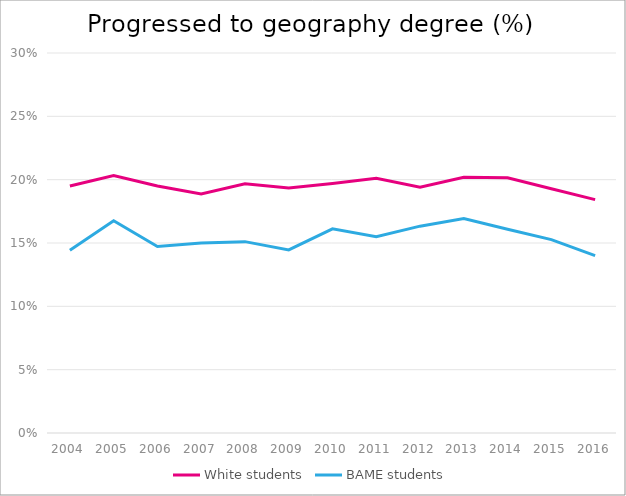
| Category | White students | BAME students |
|---|---|---|
| 2004.0 | 0.195 | 0.144 |
| 2005.0 | 0.203 | 0.168 |
| 2006.0 | 0.195 | 0.147 |
| 2007.0 | 0.189 | 0.15 |
| 2008.0 | 0.197 | 0.151 |
| 2009.0 | 0.193 | 0.145 |
| 2010.0 | 0.197 | 0.161 |
| 2011.0 | 0.201 | 0.155 |
| 2012.0 | 0.194 | 0.163 |
| 2013.0 | 0.202 | 0.169 |
| 2014.0 | 0.202 | 0.161 |
| 2015.0 | 0.193 | 0.153 |
| 2016.0 | 0.184 | 0.14 |